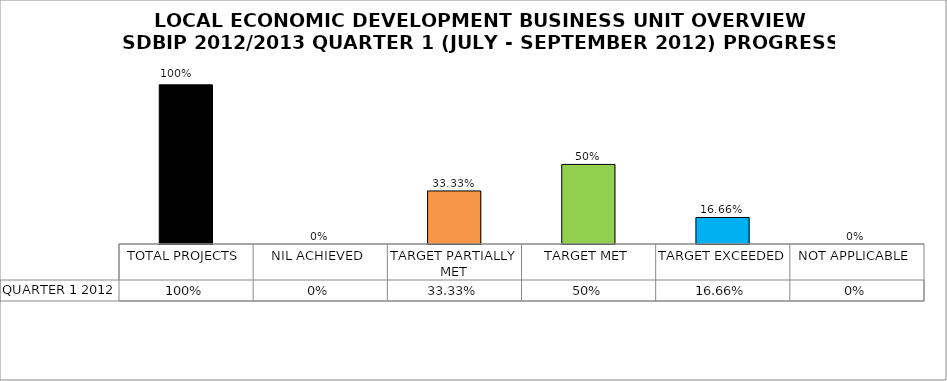
| Category | QUARTER 1 2012 |
|---|---|
| TOTAL PROJECTS | 1 |
| NIL ACHIEVED | 0 |
| TARGET PARTIALLY MET | 0.333 |
| TARGET MET | 0.5 |
| TARGET EXCEEDED | 0.167 |
| NOT APPLICABLE | 0 |